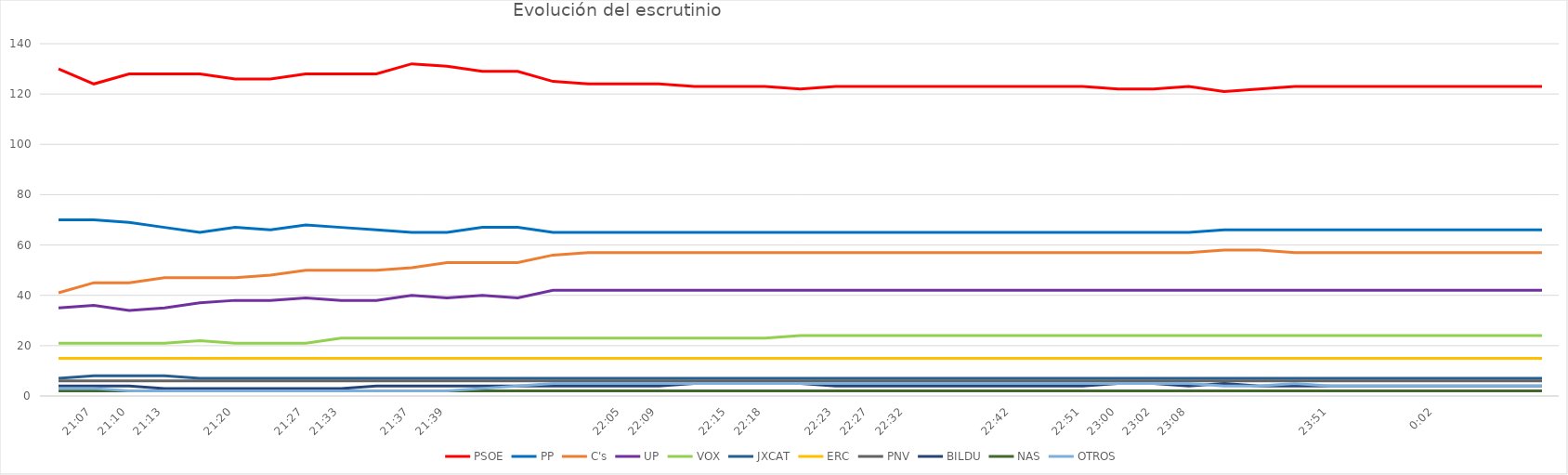
| Category | PSOE | PP | C's | UP | VOX | JXCAT | ERC | PNV | BILDU | NAS | OTROS |
|---|---|---|---|---|---|---|---|---|---|---|---|
| nan | 130 | 70 | 41 | 35 | 21 | 7 | 15 | 6 | 4 | 2 | 3 |
| 0.8798611111111111 | 124 | 70 | 45 | 36 | 21 | 8 | 15 | 6 | 4 | 2 | 3 |
| 0.8819444444444445 | 128 | 69 | 45 | 34 | 21 | 8 | 15 | 6 | 4 | 2 | 2 |
| 0.8840277777777777 | 128 | 67 | 47 | 35 | 21 | 8 | 15 | 6 | 3 | 2 | 2 |
| nan | 128 | 65 | 47 | 37 | 22 | 7 | 15 | 6 | 3 | 2 | 2 |
| 0.8888888888888888 | 126 | 67 | 47 | 38 | 21 | 7 | 15 | 6 | 3 | 2 | 2 |
| nan | 126 | 66 | 48 | 38 | 21 | 7 | 15 | 6 | 3 | 2 | 2 |
| 0.8937499999999999 | 128 | 68 | 50 | 39 | 21 | 7 | 15 | 6 | 3 | 2 | 2 |
| 0.8979166666666667 | 128 | 67 | 50 | 38 | 23 | 7 | 15 | 6 | 3 | 2 | 2 |
| nan | 128 | 66 | 50 | 38 | 23 | 7 | 15 | 6 | 4 | 2 | 2 |
| 0.9006944444444445 | 132 | 65 | 51 | 40 | 23 | 7 | 15 | 6 | 4 | 2 | 2 |
| 0.9020833333333332 | 131 | 65 | 53 | 39 | 23 | 7 | 15 | 6 | 4 | 2 | 2 |
| nan | 129 | 67 | 53 | 40 | 23 | 7 | 15 | 6 | 4 | 2 | 3 |
| nan | 129 | 67 | 53 | 39 | 23 | 7 | 15 | 6 | 4 | 2 | 4 |
| nan | 125 | 65 | 56 | 42 | 23 | 7 | 15 | 6 | 4 | 2 | 5 |
| nan | 124 | 65 | 57 | 42 | 23 | 7 | 15 | 6 | 4 | 2 | 5 |
| 0.9201388888888888 | 124 | 65 | 57 | 42 | 23 | 7 | 15 | 6 | 4 | 2 | 5 |
| 0.9229166666666666 | 124 | 65 | 57 | 42 | 23 | 7 | 15 | 6 | 4 | 2 | 5 |
| nan | 123 | 65 | 57 | 42 | 23 | 7 | 15 | 6 | 5 | 2 | 5 |
| 0.9270833333333334 | 123 | 65 | 57 | 42 | 23 | 7 | 15 | 6 | 5 | 2 | 5 |
| 0.9291666666666667 | 123 | 65 | 57 | 42 | 23 | 7 | 15 | 6 | 5 | 2 | 5 |
| nan | 122 | 65 | 57 | 42 | 24 | 7 | 15 | 6 | 5 | 2 | 5 |
| 0.9326388888888889 | 123 | 65 | 57 | 42 | 24 | 7 | 15 | 6 | 4 | 2 | 5 |
| 0.9354166666666667 | 123 | 65 | 57 | 42 | 24 | 7 | 15 | 6 | 4 | 2 | 5 |
| 0.938888888888889 | 123 | 65 | 57 | 42 | 24 | 7 | 15 | 6 | 4 | 2 | 5 |
| nan | 123 | 65 | 57 | 42 | 24 | 7 | 15 | 6 | 4 | 2 | 5 |
| nan | 123 | 65 | 57 | 42 | 24 | 7 | 15 | 6 | 4 | 2 | 5 |
| 0.9458333333333333 | 123 | 65 | 57 | 42 | 24 | 7 | 15 | 6 | 4 | 2 | 5 |
| nan | 123 | 65 | 57 | 42 | 24 | 7 | 15 | 6 | 4 | 2 | 5 |
| 0.9520833333333334 | 123 | 65 | 57 | 42 | 24 | 7 | 15 | 6 | 4 | 2 | 5 |
| 0.9583333333333334 | 122 | 65 | 57 | 42 | 24 | 7 | 15 | 6 | 5 | 2 | 5 |
| 0.9597222222222223 | 122 | 65 | 57 | 42 | 24 | 7 | 15 | 6 | 5 | 2 | 5 |
| 0.9638888888888889 | 123 | 65 | 57 | 42 | 24 | 7 | 15 | 6 | 4 | 2 | 5 |
| nan | 121 | 66 | 58 | 42 | 24 | 7 | 15 | 6 | 5 | 2 | 4 |
| nan | 122 | 66 | 58 | 42 | 24 | 7 | 15 | 6 | 4 | 2 | 4 |
| nan | 123 | 66 | 57 | 42 | 24 | 7 | 15 | 6 | 4 | 2 | 5 |
| 0.99375 | 123 | 66 | 57 | 42 | 24 | 7 | 15 | 6 | 4 | 2 | 4 |
| nan | 123 | 66 | 57 | 42 | 24 | 7 | 15 | 6 | 4 | 2 | 4 |
| nan | 123 | 66 | 57 | 42 | 24 | 7 | 15 | 6 | 4 | 2 | 4 |
| 0.001388888888888889 | 123 | 66 | 57 | 42 | 24 | 7 | 15 | 6 | 4 | 2 | 4 |
| nan | 123 | 66 | 57 | 42 | 24 | 7 | 15 | 6 | 4 | 2 | 4 |
| nan | 123 | 66 | 57 | 42 | 24 | 7 | 15 | 6 | 4 | 2 | 4 |
| nan | 123 | 66 | 57 | 42 | 24 | 7 | 15 | 6 | 4 | 2 | 4 |